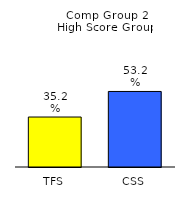
| Category | Series 0 |
|---|---|
| TFS | 0.352 |
| CSS | 0.532 |